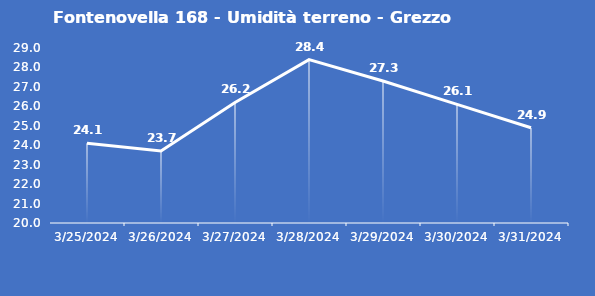
| Category | Fontenovella 168 - Umidità terreno - Grezzo (%VWC) |
|---|---|
| 3/25/24 | 24.1 |
| 3/26/24 | 23.7 |
| 3/27/24 | 26.2 |
| 3/28/24 | 28.4 |
| 3/29/24 | 27.3 |
| 3/30/24 | 26.1 |
| 3/31/24 | 24.9 |